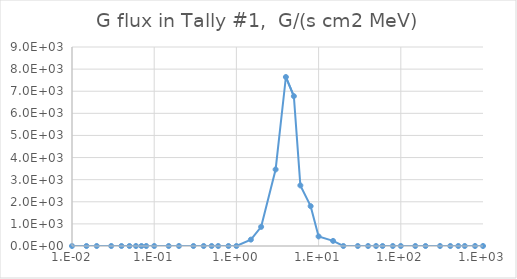
| Category | Series 0 |
|---|---|
| 0.01 | 0 |
| 0.015 | 0 |
| 0.02 | 0 |
| 0.03 | 0 |
| 0.04 | 0 |
| 0.05 | 0 |
| 0.06 | 0 |
| 0.07 | 0 |
| 0.08 | 0 |
| 0.1 | 0 |
| 0.15 | 0 |
| 0.2 | 0 |
| 0.3 | 0 |
| 0.4 | 0 |
| 0.5 | 0 |
| 0.6 | 0 |
| 0.8 | 0 |
| 1.0 | 0 |
| 1.5 | 288.41 |
| 2.0 | 865.222 |
| 3.0 | 3460.88 |
| 4.0 | 7642.79 |
| 5.0 | 6777.56 |
| 6.0 | 2739.87 |
| 8.0 | 1802.542 |
| 10.0 | 432.61 |
| 15.0 | 230.726 |
| 20.0 | 0 |
| 30.0 | 0 |
| 40.0 | 0 |
| 50.0 | 0 |
| 60.0 | 0 |
| 80.0 | 0 |
| 100.0 | 0 |
| 150.0 | 0 |
| 200.0 | 0 |
| 300.0 | 0 |
| 400.0 | 0 |
| 500.0 | 0 |
| 600.0 | 0 |
| 800.0 | 0 |
| 1000.0 | 0 |
| 1500.0 | 0 |
| 2000.0 | 0 |
| 3000.0 | 0 |
| 4000.0 | 0 |
| 5000.0 | 0 |
| 6000.0 | 0 |
| 8000.0 | 0 |
| 10000.0 | 0 |